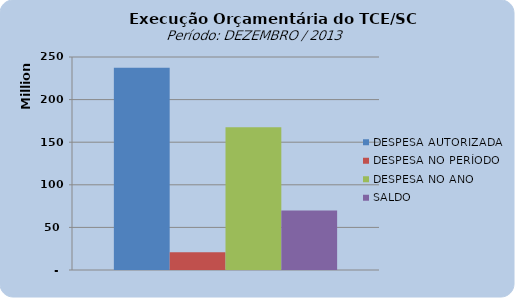
| Category | DESPESA AUTORIZADA | DESPESA NO PERÍODO | DESPESA NO ANO | SALDO |
|---|---|---|---|---|
| 0 | 237353175.67 | 20809065.46 | 167635763.44 | 69717412.23 |